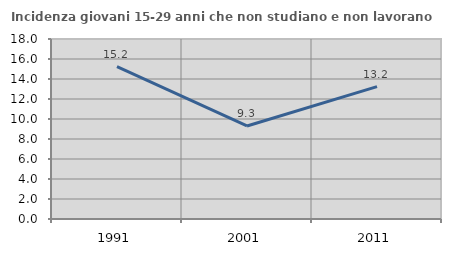
| Category | Incidenza giovani 15-29 anni che non studiano e non lavorano  |
|---|---|
| 1991.0 | 15.242 |
| 2001.0 | 9.304 |
| 2011.0 | 13.24 |